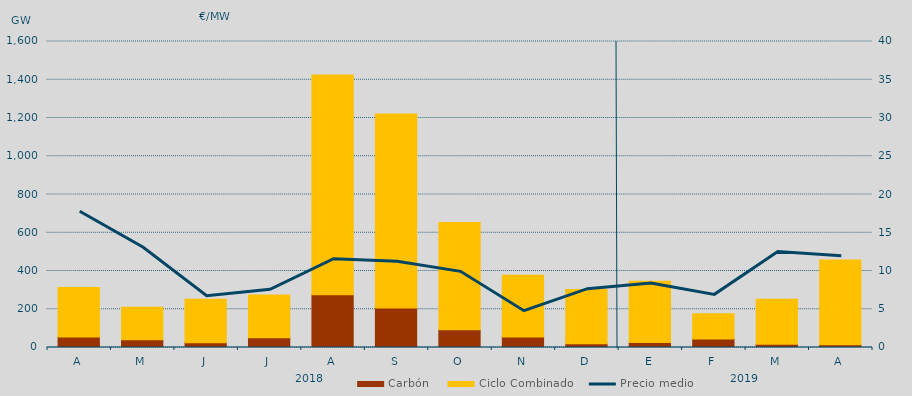
| Category | Carbón | Ciclo Combinado |
|---|---|---|
| A | 55123 | 258682.2 |
| M | 40054.5 | 170347.3 |
| J | 24939.8 | 227127.5 |
| J | 50362.4 | 224750.8 |
| A | 276044.1 | 1148967.5 |
| S | 206113.1 | 1015257.7 |
| O | 93052.3 | 560872.2 |
| N | 55331.6 | 322094.1 |
| D | 19590.2 | 283346.4 |
| E | 26403.5 | 320317.9 |
| F | 44880.1 | 131505 |
| M | 17298.8 | 234585 |
| A | 14816 | 442359.9 |